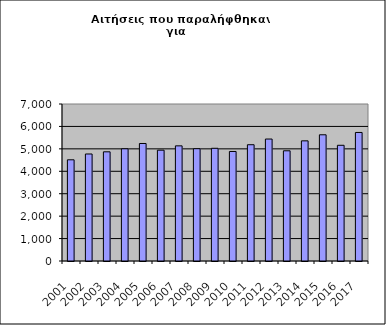
| Category | Series 1 |
|---|---|
| 2001.0 | 4512 |
| 2002.0 | 4771 |
| 2003.0 | 4868 |
| 2004.0 | 5004 |
| 2005.0 | 5239 |
| 2006.0 | 4941 |
| 2007.0 | 5134 |
| 2008.0 | 5007 |
| 2009.0 | 5025 |
| 2010.0 | 4883 |
| 2011.0 | 5184 |
| 2012.0 | 5438 |
| 2013.0 | 4914 |
| 2014.0 | 5357 |
| 2015.0 | 5627 |
| 2016.0 | 5159 |
| 2017.0 | 5731 |